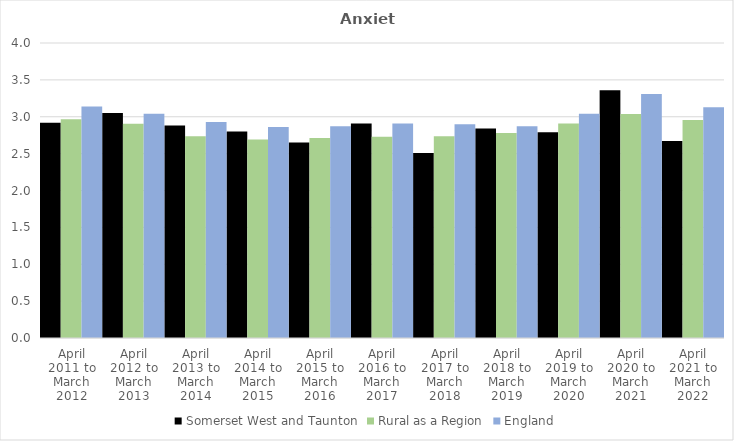
| Category | Somerset West and Taunton | Rural as a Region | England |
|---|---|---|---|
| April 2011 to March 2012 | 2.92 | 2.967 | 3.14 |
| April 2012 to March 2013 | 3.05 | 2.904 | 3.04 |
| April 2013 to March 2014 | 2.88 | 2.734 | 2.93 |
| April 2014 to March 2015 | 2.8 | 2.691 | 2.86 |
| April 2015 to March 2016 | 2.65 | 2.711 | 2.87 |
| April 2016 to March 2017 | 2.91 | 2.729 | 2.91 |
| April 2017 to March 2018 | 2.51 | 2.736 | 2.9 |
| April 2018 to March 2019 | 2.84 | 2.78 | 2.87 |
| April 2019 to March 2020 | 2.79 | 2.908 | 3.04 |
| April 2020 to March 2021 | 3.36 | 3.036 | 3.31 |
| April 2021 to March 2022 | 2.67 | 2.956 | 3.13 |